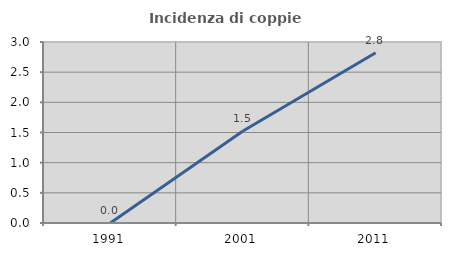
| Category | Incidenza di coppie miste |
|---|---|
| 1991.0 | 0 |
| 2001.0 | 1.524 |
| 2011.0 | 2.823 |